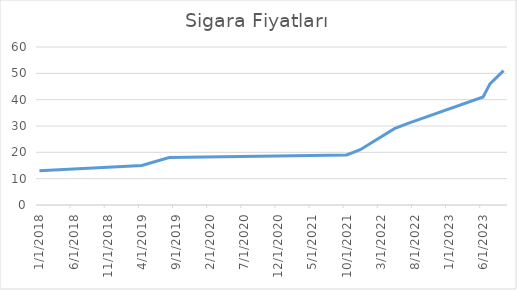
| Category | Fiyat |
|---|---|
| 1/3/18 | 13 |
| 4/6/19 | 15 |
| 8/5/19 | 18 |
| 10/5/21 | 19 |
| 12/8/21 | 21 |
| 5/28/22 | 29 |
| 7/4/22 | 31 |
| 6/5/23 | 41 |
| 7/23/23 | 46 |
| 9/4/23 | 51 |